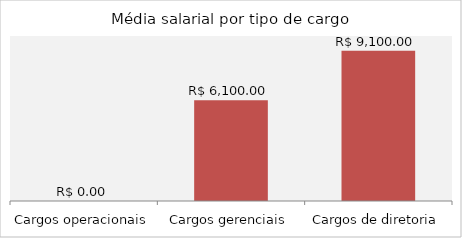
| Category | Series 0 |
|---|---|
| Cargos operacionais | 0 |
| Cargos gerenciais | 6100 |
| Cargos de diretoria | 9100 |